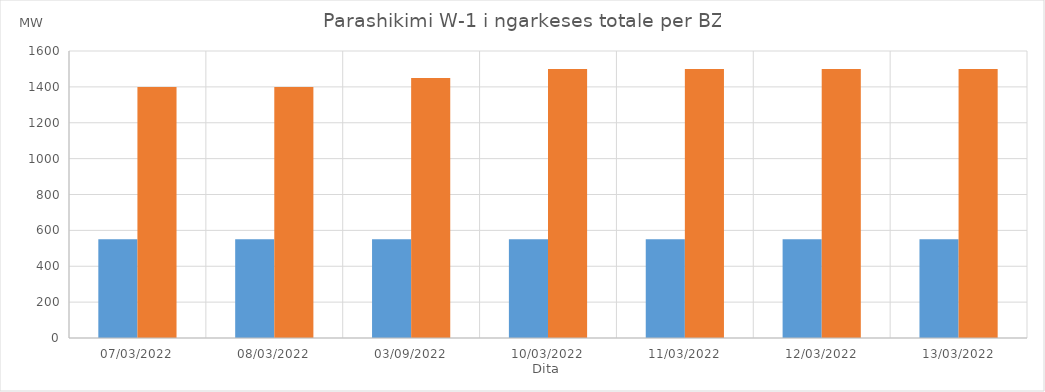
| Category | Min (MW) | Max (MW) |
|---|---|---|
| 07/03/2022 | 550 | 1400 |
| 08/03/2022 | 550 | 1400 |
| 03/09/2022 | 550 | 1450 |
| 10/03/2022 | 550 | 1500 |
| 11/03/2022 | 550 | 1500 |
| 12/03/2022 | 550 | 1500 |
| 13/03/2022 | 550 | 1500 |